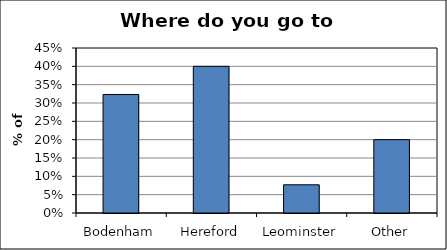
| Category | Series 0 |
|---|---|
| Bodenham | 0.323 |
| Hereford | 0.4 |
| Leominster | 0.077 |
| Other | 0.2 |